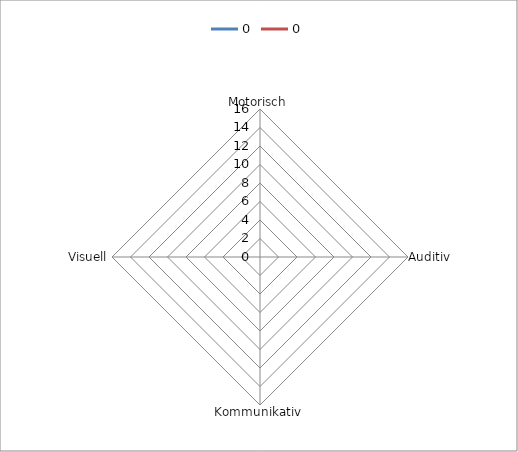
| Category | 0 |
|---|---|
| Motorisch | 0 |
| Auditiv | 0 |
| Kommunikativ | 0 |
| Visuell | 0 |